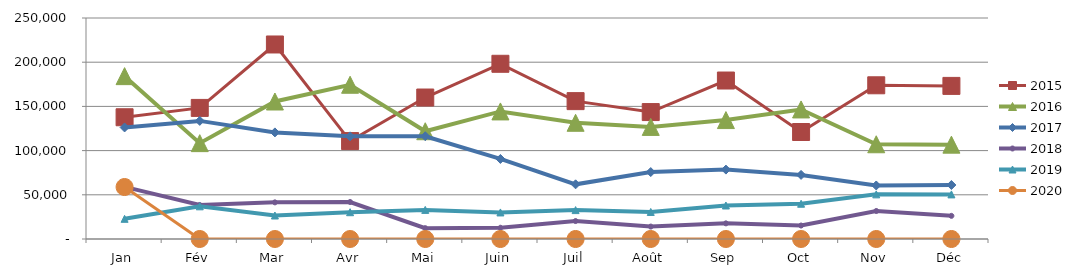
| Category | 2015 | 2016 | 2017 | 2018 | 2019 | 2020 |
|---|---|---|---|---|---|---|
| Jan | 137713.474 | 184232.553 | 126197.515 | 58992.727 | 22835.141 | 58790.585 |
| Fév | 148295.278 | 108445.311 | 133601.162 | 38474.634 | 36964.987 | 0 |
| Mar | 220042.177 | 155536.423 | 120591.652 | 41446.118 | 26566.504 | 0 |
| Avr | 110781.335 | 174480.572 | 116118.947 | 41867.578 | 30312.298 | 0 |
| Mai | 160048.852 | 121919.747 | 116249.349 | 12225.209 | 32920.271 | 0 |
| Juin | 198197.034 | 144314.426 | 90555.217 | 12731.198 | 30030.503 | 0 |
| Juil | 155965.43 | 131454.744 | 61851.658 | 20324.43 | 32688.868 | 0 |
| Août | 143590.344 | 126814.647 | 75725.137 | 14054.589 | 30593.377 | 0 |
| Sep | 179276.03 | 134534.845 | 78513.546 | 17695.021 | 37905.19 | 0 |
| Oct | 121038.645 | 146556.306 | 72510.099 | 15242.364 | 39891.637 | 0 |
| Nov | 173874.86 | 107167.576 | 60542.91 | 31689.585 | 50491.414 | 0 |
| Déc | 173191.088 | 106719.407 | 61092.454 | 26183.332 | 50462.538 | 0 |